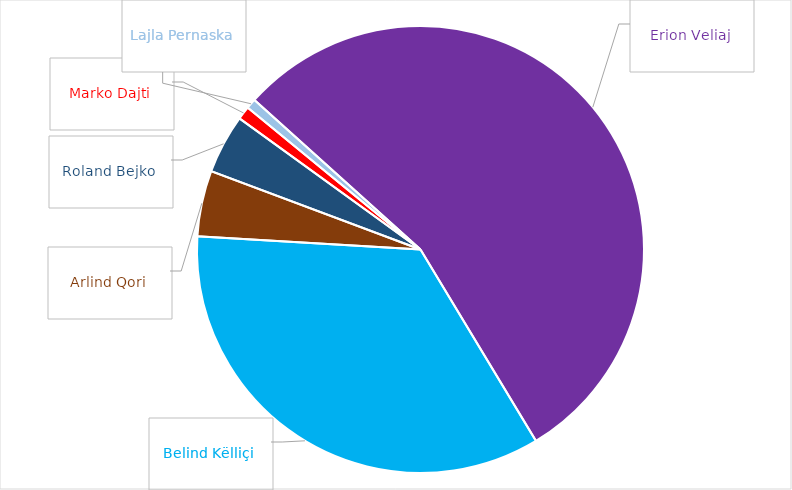
| Category | Series 0 |
|---|---|
| Partia Socialiste | 158852 |
| Bashkë Fitojmë | 100422 |
| Lëvizja Bashkë | 13851 |
| Partia Demokratike | 12398 |
| Fronti i Majtë | 2809 |
| Partia Drejtësi, Integrim dhe Unitet | 2107 |